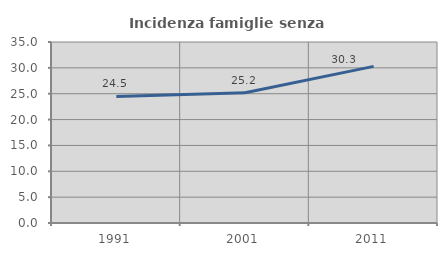
| Category | Incidenza famiglie senza nuclei |
|---|---|
| 1991.0 | 24.481 |
| 2001.0 | 25.2 |
| 2011.0 | 30.282 |